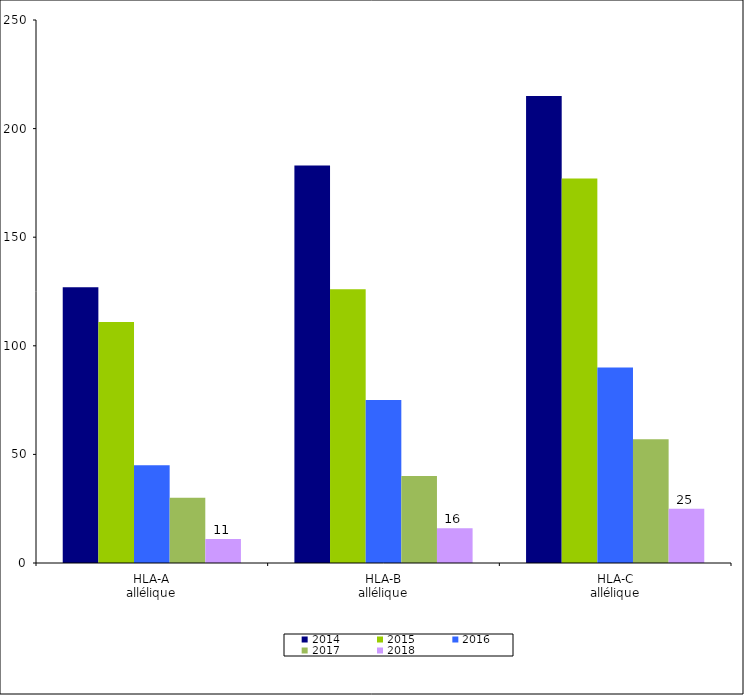
| Category | 2014 | 2015 | 2016 | 2017 | 2018 |
|---|---|---|---|---|---|
| HLA-A
allélique | 127 | 111 | 45 | 30 | 11 |
| HLA-B
allélique | 183 | 126 | 75 | 40 | 16 |
| HLA-C
allélique | 215 | 177 | 90 | 57 | 25 |